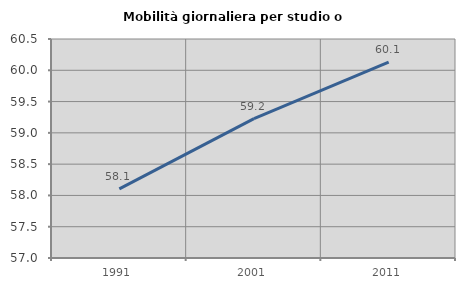
| Category | Mobilità giornaliera per studio o lavoro |
|---|---|
| 1991.0 | 58.106 |
| 2001.0 | 59.226 |
| 2011.0 | 60.129 |